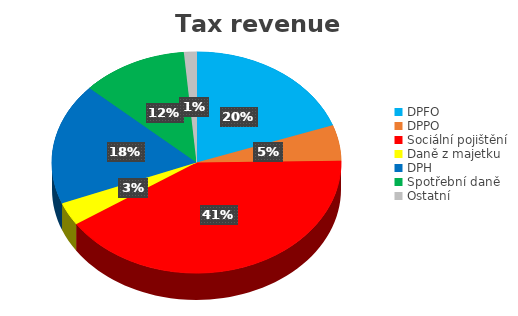
| Category | Series 0 | Series 1 |
|---|---|---|
| DPFO | 0.195 | 46638 |
| DPPO | 0.052 | 12447 |
| Sociální pojištění | 0.408 | 97512 |
| Daně z majetku | 0.034 | 8083 |
| DPH | 0.178 | 42424 |
| Spotřební daně | 0.119 | 28296 |
| Ostatní | 0.014 | 3333 |